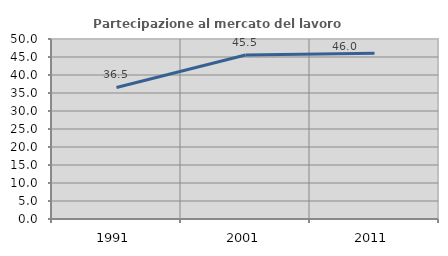
| Category | Partecipazione al mercato del lavoro  femminile |
|---|---|
| 1991.0 | 36.538 |
| 2001.0 | 45.545 |
| 2011.0 | 46.018 |